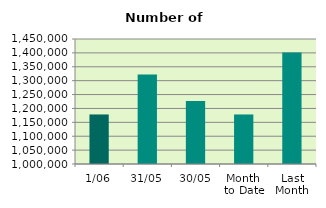
| Category | Series 0 |
|---|---|
| 1/06 | 1178340 |
| 31/05 | 1322290 |
| 30/05 | 1226946 |
| Month 
to Date | 1178340 |
| Last
Month | 1401172.455 |